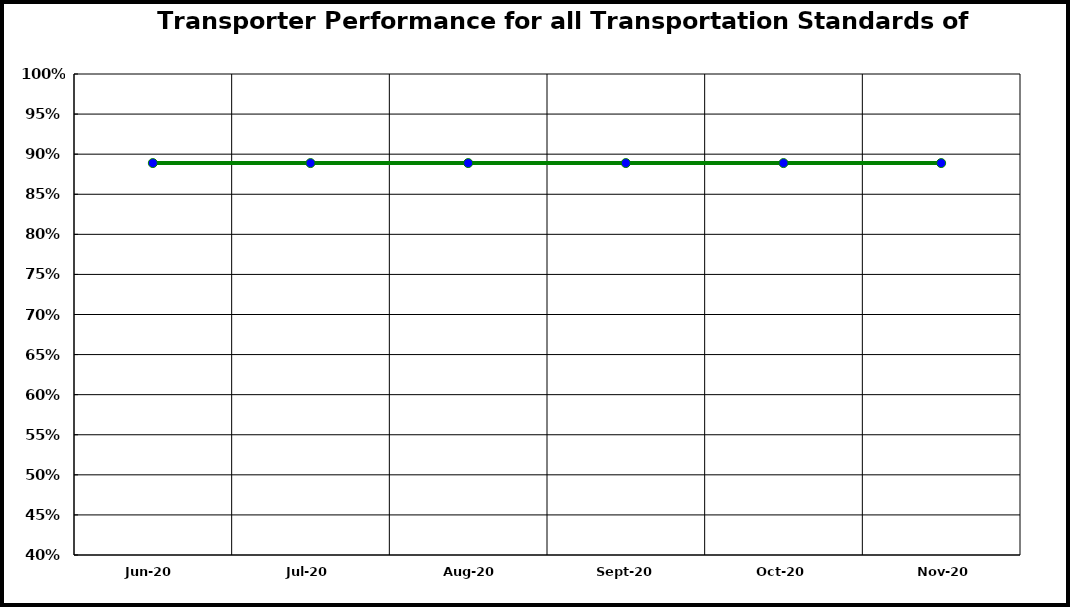
| Category | Performance |
|---|---|
| 2020-06-01 | 0.889 |
| 2020-07-01 | 0.889 |
| 2020-08-01 | 0.889 |
| 2020-09-01 | 0.889 |
| 2020-10-01 | 0.889 |
| 2020-11-01 | 0.889 |